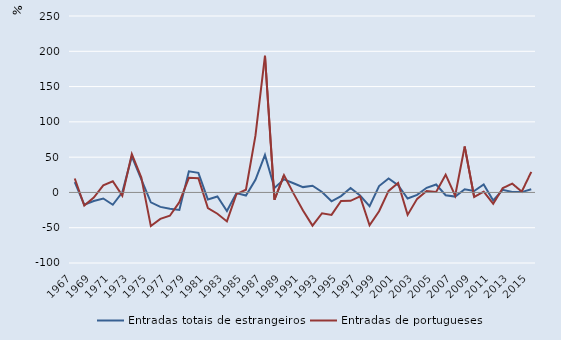
| Category | Entradas totais de estrangeiros | Entradas de portugueses |
|---|---|---|
| 1967.0 | 14.446 | 19.798 |
| 1968.0 | -17.455 | -18.547 |
| 1969.0 | -12.199 | -7.185 |
| 1970.0 | -8.554 | 10.025 |
| 1971.0 | -17.475 | 15.882 |
| 1972.0 | 0.087 | -4.587 |
| 1973.0 | 50.976 | 54.321 |
| 1974.0 | 18.602 | 21.138 |
| 1975.0 | -13.999 | -47.67 |
| 1976.0 | -20.466 | -37.475 |
| 1977.0 | -23.098 | -33.028 |
| 1978.0 | -24.889 | -13.775 |
| 1979.0 | 29.872 | 20.642 |
| 1980.0 | 27.692 | 20.145 |
| 1981.0 | -10.128 | -22.066 |
| 1982.0 | -5.801 | -30.235 |
| 1983.0 | -26.402 | -41.077 |
| 1984.0 | -1.024 | -2.442 |
| 1985.0 | -4.446 | 3.791 |
| 1986.0 | 17.79 | 80.358 |
| 1987.0 | 53.069 | 193.619 |
| 1988.0 | 6.252 | -10.359 |
| 1989.0 | 18.544 | 24.419 |
| 1990.0 | 13 | -1.377 |
| 1991.0 | 7.549 | -25.627 |
| 1992.0 | 9.449 | -47.057 |
| 1993.0 | 0.726 | -29.477 |
| 1994.0 | -12.568 | -31.87 |
| 1995.0 | -5.134 | -12.133 |
| 1996.0 | 6.205 | -11.957 |
| 1997.0 | -4.439 | -5.659 |
| 1998.0 | -19.368 | -46.444 |
| 1999.0 | 9.044 | -26.72 |
| 2000.0 | 19.753 | 2.183 |
| 2001.0 | 10.193 | 13.462 |
| 2002.0 | -8.591 | -31.827 |
| 2003.0 | -3.372 | -9.116 |
| 2004.0 | 6.532 | 2.128 |
| 2005.0 | 11.188 | 0.595 |
| 2006.0 | -4.041 | 25.148 |
| 2007.0 | -5.916 | -4.728 |
| 2008.0 | 4.434 | 65.012 |
| 2009.0 | 2.005 | -6.466 |
| 2010.0 | 11.305 | 1.125 |
| 2011.0 | -11.398 | -16.057 |
| 2012.0 | 3.649 | 6.061 |
| 2013.0 | 0.477 | 12.5 |
| 2014.0 | 0.48 | 1.111 |
| 2015.0 | 4.443 | 29.042 |